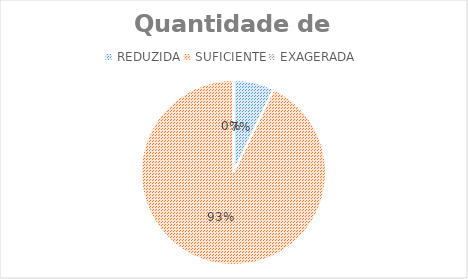
| Category | Alunos |
|---|---|
| REDUZIDA | 6 |
| SUFICIENTE | 78 |
| EXAGERADA | 0 |